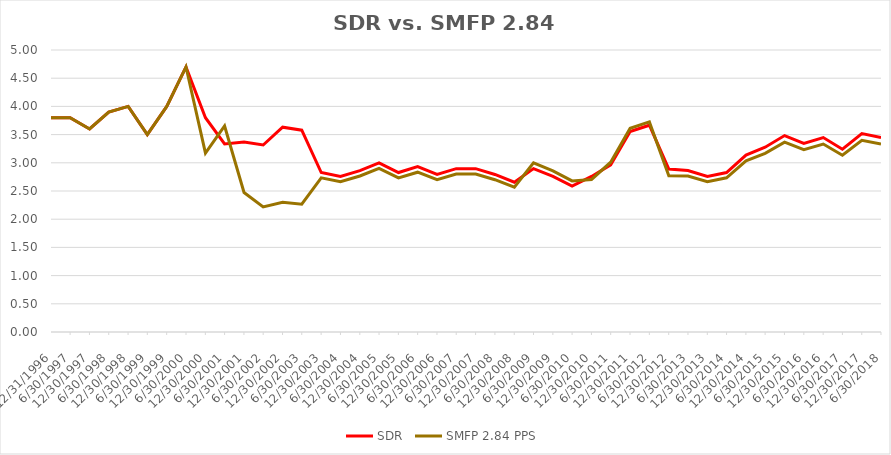
| Category | SDR | SMFP 2.84 PPS |
|---|---|---|
| 12/31/96 | 3.8 | 3.8 |
| 6/30/97 | 3.8 | 3.8 |
| 12/31/97 | 3.6 | 3.6 |
| 6/30/98 | 3.9 | 3.9 |
| 12/31/98 | 4 | 4 |
| 6/30/99 | 3.5 | 3.5 |
| 12/31/99 | 4 | 4 |
| 6/30/00 | 4.7 | 4.7 |
| 12/31/00 | 3.8 | 3.172 |
| 6/30/01 | 3.333 | 3.652 |
| 12/31/01 | 3.368 | 2.474 |
| 6/30/02 | 3.316 | 2.217 |
| 12/31/02 | 3.632 | 2.3 |
| 6/30/03 | 3.579 | 2.267 |
| 12/31/03 | 2.828 | 2.733 |
| 6/30/04 | 2.759 | 2.667 |
| 12/31/04 | 2.862 | 2.767 |
| 6/30/05 | 3 | 2.9 |
| 12/31/05 | 2.828 | 2.733 |
| 6/30/06 | 2.931 | 2.833 |
| 12/31/06 | 2.793 | 2.7 |
| 6/30/07 | 2.897 | 2.8 |
| 12/31/07 | 2.897 | 2.8 |
| 6/30/08 | 2.793 | 2.7 |
| 12/31/08 | 2.655 | 2.567 |
| 6/30/09 | 2.897 | 3 |
| 12/31/09 | 2.759 | 2.857 |
| 6/30/10 | 2.586 | 2.679 |
| 12/31/10 | 2.759 | 2.705 |
| 6/30/11 | 2.963 | 3.01 |
| 12/31/11 | 3.556 | 3.612 |
| 6/30/12 | 3.667 | 3.725 |
| 12/31/12 | 2.889 | 2.769 |
| 6/30/13 | 2.862 | 2.767 |
| 12/31/13 | 2.759 | 2.667 |
| 6/30/14 | 2.828 | 2.733 |
| 12/31/14 | 3.138 | 3.033 |
| 6/30/15 | 3.276 | 3.167 |
| 12/31/15 | 3.483 | 3.367 |
| 6/30/16 | 3.345 | 3.233 |
| 12/31/16 | 3.448 | 3.333 |
| 6/30/17 | 3.241 | 3.133 |
| 12/31/17 | 3.517 | 3.4 |
| 6/30/18 | 3.448 | 3.333 |